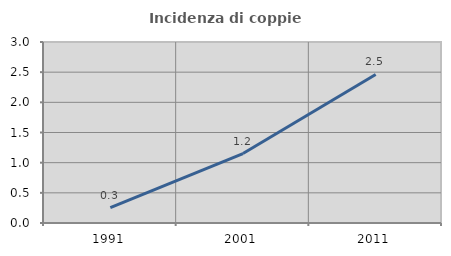
| Category | Incidenza di coppie miste |
|---|---|
| 1991.0 | 0.253 |
| 2001.0 | 1.151 |
| 2011.0 | 2.462 |